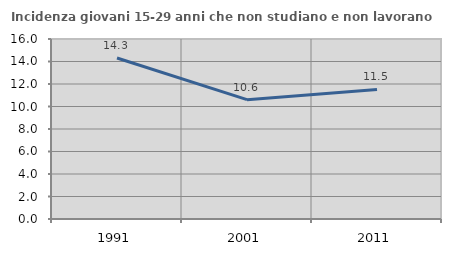
| Category | Incidenza giovani 15-29 anni che non studiano e non lavorano  |
|---|---|
| 1991.0 | 14.314 |
| 2001.0 | 10.61 |
| 2011.0 | 11.516 |